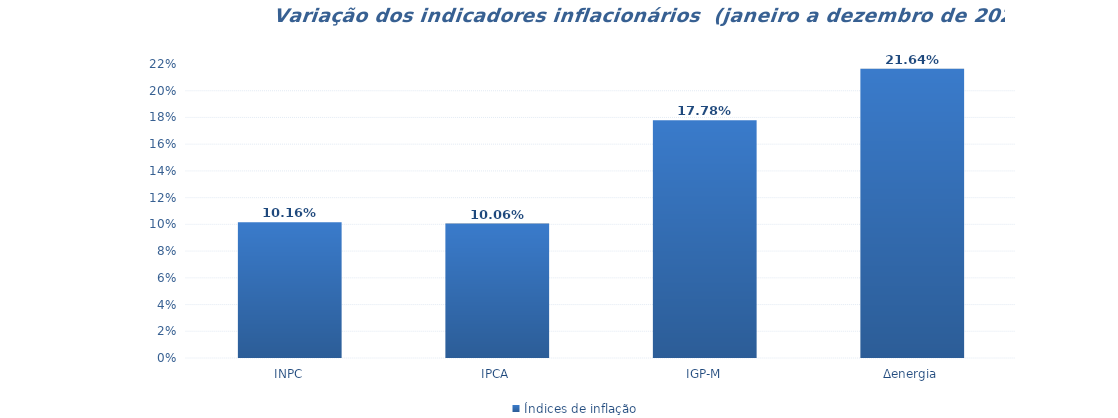
| Category | Índices de inflação |
|---|---|
| INPC | 0.102 |
| IPCA | 0.101 |
| IGP-M | 0.178 |
| Δenergia | 0.216 |